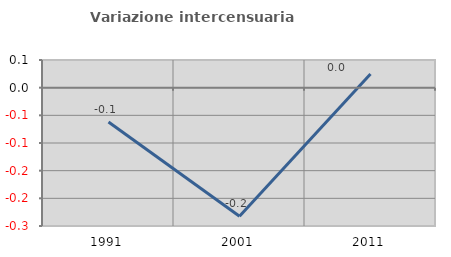
| Category | Variazione intercensuaria annua |
|---|---|
| 1991.0 | -0.062 |
| 2001.0 | -0.232 |
| 2011.0 | 0.025 |